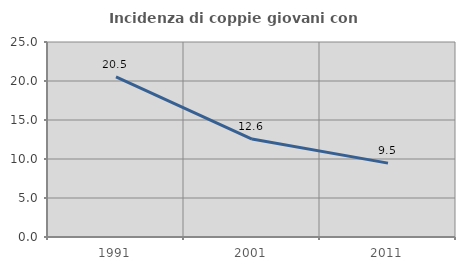
| Category | Incidenza di coppie giovani con figli |
|---|---|
| 1991.0 | 20.539 |
| 2001.0 | 12.551 |
| 2011.0 | 9.474 |